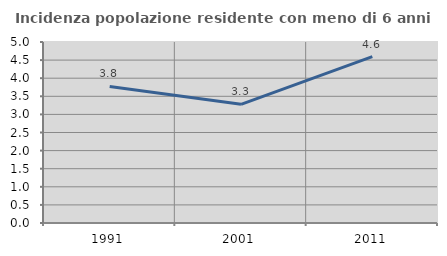
| Category | Incidenza popolazione residente con meno di 6 anni |
|---|---|
| 1991.0 | 3.774 |
| 2001.0 | 3.279 |
| 2011.0 | 4.598 |